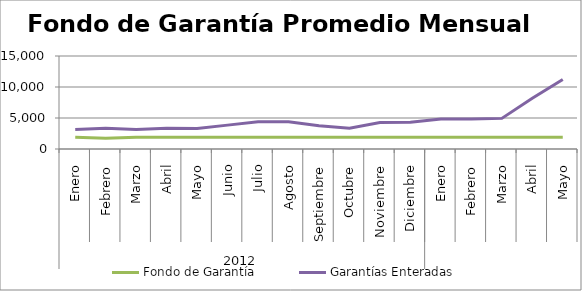
| Category | Fondo de Garantía | Garantías Enteradas |
|---|---|---|
| 0 | 1896.798 | 3141.641 |
| 1 | 1714.423 | 3362.648 |
| 2 | 1900.513 | 3154.118 |
| 3 | 1900.513 | 3348.058 |
| 4 | 1898.685 | 3308.859 |
| 5 | 1900.513 | 3850.375 |
| 6 | 1900.513 | 4400.539 |
| 7 | 1895.388 | 4383.327 |
| 8 | 1900.513 | 3757.632 |
| 9 | 1900.513 | 3362.932 |
| 10 | 1900.311 | 4285.609 |
| 11 | 1890.98 | 4296.87 |
| 12 | 1898.667 | 4842.786 |
| 13 | 1900.512 | 4845.136 |
| 14 | 1900.513 | 4938.365 |
| 15 | 1900.513 | 8179.666 |
| 16 | 1900.513 | 11202.213 |